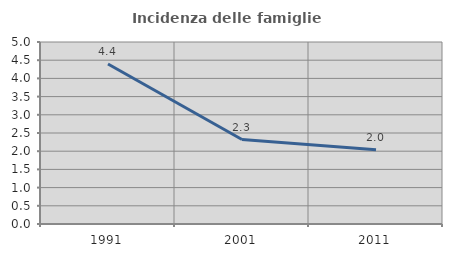
| Category | Incidenza delle famiglie numerose |
|---|---|
| 1991.0 | 4.395 |
| 2001.0 | 2.321 |
| 2011.0 | 2.043 |